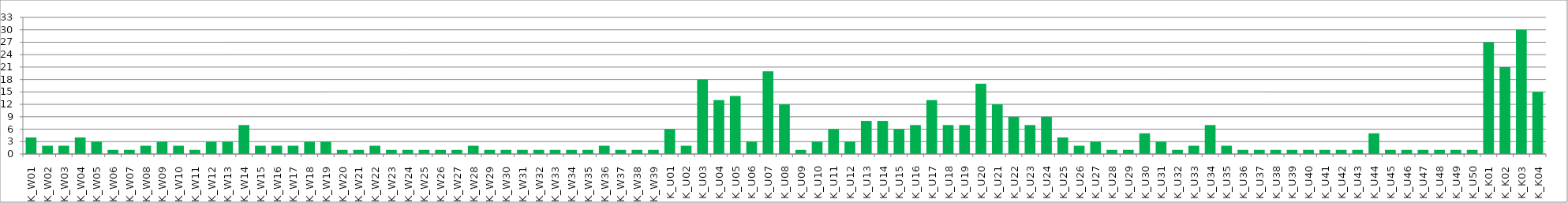
| Category | Series 0 |
|---|---|
| K_W01 | 4 |
| K_W02 | 2 |
| K_W03 | 2 |
| K_W04 | 4 |
| K_W05 | 3 |
| K_W06 | 1 |
| K_W07 | 1 |
| K_W08 | 2 |
| K_W09 | 3 |
| K_W10 | 2 |
| K_W11 | 1 |
| K_W12 | 3 |
| K_W13 | 3 |
| K_W14 | 7 |
| K_W15 | 2 |
| K_W16 | 2 |
| K_W17 | 2 |
| K_W18 | 3 |
| K_W19 | 3 |
| K_W20 | 1 |
| K_W21 | 1 |
| K_W22 | 2 |
| K_W23 | 1 |
| K_W24 | 1 |
| K_W25 | 1 |
| K_W26 | 1 |
| K_W27 | 1 |
| K_W28 | 2 |
| K_W29 | 1 |
| K_W30 | 1 |
| K_W31 | 1 |
| K_W32 | 1 |
| K_W33 | 1 |
| K_W34 | 1 |
| K_W35 | 1 |
| K_W36 | 2 |
| K_W37 | 1 |
| K_W38 | 1 |
| K_W39 | 1 |
| K_U01 | 6 |
| K_U02 | 2 |
| K_U03 | 18 |
| K_U04 | 13 |
| K_U05 | 14 |
| K_U06 | 3 |
| K_U07 | 20 |
| K_U08 | 12 |
| K_U09 | 1 |
| K_U10 | 3 |
| K_U11 | 6 |
| K_U12 | 3 |
| K_U13 | 8 |
| K_U14 | 8 |
| K_U15 | 6 |
| K_U16 | 7 |
| K_U17 | 13 |
| K_U18 | 7 |
| K_U19 | 7 |
| K_U20 | 17 |
| K_U21 | 12 |
| K_U22 | 9 |
| K_U23 | 7 |
| K_U24 | 9 |
| K_U25 | 4 |
| K_U26 | 2 |
| K_U27 | 3 |
| K_U28 | 1 |
| K_U29 | 1 |
| K_U30 | 5 |
| K_U31 | 3 |
| K_U32 | 1 |
| K_U33 | 2 |
| K_U34 | 7 |
| K_U35 | 2 |
| K_U36 | 1 |
| K_U37 | 1 |
| K_U38 | 1 |
| K_U39 | 1 |
| K_U40 | 1 |
| K_U41 | 1 |
| K_U42 | 1 |
| K_U43 | 1 |
| K_U44 | 5 |
| K_U45 | 1 |
| K_U46 | 1 |
| K_U47 | 1 |
| K_U48 | 1 |
| K_U49 | 1 |
| K_U50 | 1 |
| K_K01 | 27 |
| K_K02 | 21 |
| K_K03 | 30 |
| K_K04 | 15 |